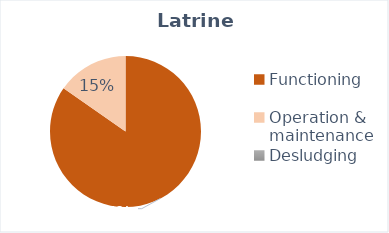
| Category | Series 0 |
|---|---|
| Functioning | 4507 |
| Operation & maintenance | 815 |
| Desludging | 0 |